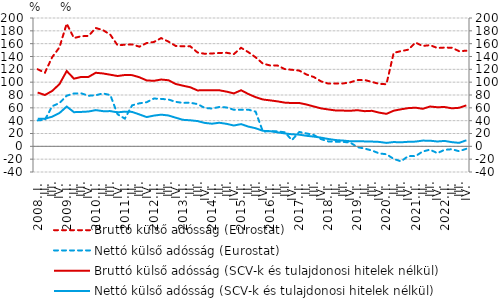
| Category | Bruttó külső adósság (Eurostat) | Nettó külső adósság (Eurostat) | Bruttó külső adósság (SCV-k és tulajdonosi hitelek nélkül) |
|---|---|---|---|
| 2008. I. | 120.095 | 40.4 | 83.857 |
|          II. | 114.77 | 41.3 | 79.961 |
|          III. | 138.881 | 62.5 | 86.324 |
|          IV. | 154.146 | 67.4 | 96.87 |
| 2009. I. | 191.233 | 78.9 | 117.325 |
|          II. | 168.777 | 82.4 | 105.436 |
|          III. | 171.587 | 82.6 | 108.132 |
|          IV. | 172.092 | 78.8 | 108.199 |
| 2010. I. | 184.399 | 79.7 | 114.644 |
|          II. | 181.075 | 82.4 | 113.577 |
|          III. | 173.985 | 79.9 | 111.598 |
|          IV. | 157.463 | 50 | 109.6 |
| 2011. I. | 158.346 | 43.2 | 111.153 |
|          II. | 158.832 | 63.9 | 110.959 |
|          III. | 155.275 | 67 | 107.673 |
|          IV. | 160.912 | 68.7 | 102.749 |
| 2012. I. | 162.597 | 74.5 | 102.077 |
|          II. | 168.703 | 73.9 | 104.115 |
|          III. | 163.181 | 73 | 102.998 |
|          IV. | 156.48 | 69.3 | 97.225 |
| 2013. I. | 155.874 | 67.7 | 94.495 |
| II. | 155.938 | 68 | 92.085 |
|          III. | 146.263 | 65.8 | 87.148 |
| IV. | 144.207 | 59.9 | 87.426 |
| 2014. I. | 144.703 | 58.9 | 87.515 |
| II. | 145.466 | 61.3 | 87.366 |
|          III. | 145.799 | 60.6 | 85.24 |
| IV. | 143.774 | 57 | 82.439 |
| 2015. I. | 153.581 | 57 | 87.432 |
| II. | 146.764 | 57.1 | 81.526 |
|          III. | 138.694 | 54.1 | 76.623 |
| IV. | 128.896 | 23 | 72.998 |
| 2016. I. | 126.063 | 23.7 | 71.612 |
| II. | 126.094 | 23.3 | 70.086 |
|          III. | 120.396 | 21.9 | 68.124 |
| IV. | 119.283 | 9.77 | 67.465 |
| 2017. I. | 118.074 | 22.408 | 67.582 |
| II. | 111.944 | 20.075 | 65.179 |
|          III. | 108.022 | 17.717 | 62.12 |
| IV. | 101.242 | 11.237 | 59.162 |
| 2018. I. | 97.768 | 7.672 | 57.462 |
| II. | 97.928 | 7.223 | 55.916 |
|          III. | 97.945 | 6.866 | 55.699 |
| IV. | 99.678 | 6.037 | 55.385 |
| 2019. I. | 103.26 | -1.224 | 56.327 |
| II. | 103.367 | -3.455 | 54.805 |
|          III. | 100.398 | -6.54 | 55.332 |
| IV. | 97.349 | -10.954 | 52.551 |
| 2020. I. | 96.791 | -12.382 | 50.611 |
| II. | 145.688 | -19.568 | 55.52 |
|          III. | 148.375 | -23.391 | 57.712 |
| IV. | 150.612 | -15.268 | 59.538 |
| 2021. I. | 161.619 | -15.208 | 60.228 |
| II. | 156.412 | -8.026 | 58.493 |
|          III. | 157.693 | -5.166 | 62.04 |
| IV. | 153.26 | -10.618 | 60.936 |
| 2022. I. | 153.922 | -5.465 | 61.279 |
| II. | 153.72 | -4.515 | 59.261 |
|          III. | 148.281 | -7.602 | 60.033 |
| IV. | 149.01 | -3.798 | 63.786 |